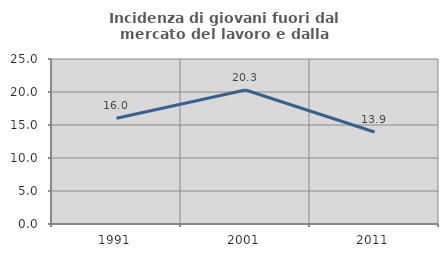
| Category | Incidenza di giovani fuori dal mercato del lavoro e dalla formazione  |
|---|---|
| 1991.0 | 16.022 |
| 2001.0 | 20.301 |
| 2011.0 | 13.94 |